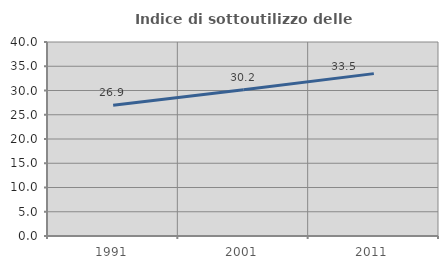
| Category | Indice di sottoutilizzo delle abitazioni  |
|---|---|
| 1991.0 | 26.945 |
| 2001.0 | 30.177 |
| 2011.0 | 33.481 |